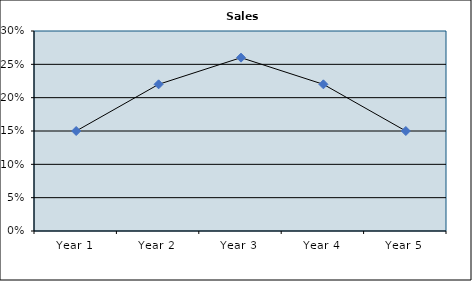
| Category | Series 0 |
|---|---|
| Year 1 | 0.15 |
| Year 2 | 0.22 |
| Year 3 | 0.26 |
| Year 4 | 0.22 |
| Year 5 | 0.15 |